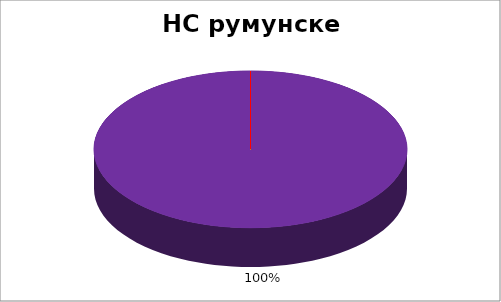
| Category | НС румунске НМ |
|---|---|
| 0 | 0 |
| 1 | 0 |
| 2 | 0 |
| 3 | 0 |
| 4 | 1 |